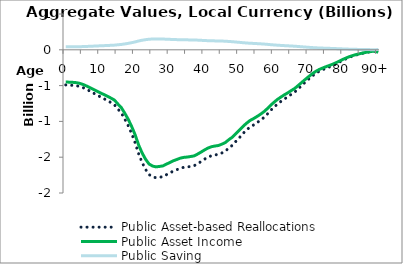
| Category | Public Asset-based Reallocations | Public Asset Income | Public Saving |
|---|---|---|---|
| 0 | -490.692 | -449.071 | 41.621 |
|  | -494.131 | -452.218 | 41.913 |
| 2 | -496.348 | -454.247 | 42.101 |
| 3 | -501.32 | -458.797 | 42.523 |
| 4 | -511.72 | -468.315 | 43.405 |
| 5 | -528.914 | -484.05 | 44.863 |
| 6 | -552.434 | -505.576 | 46.858 |
| 7 | -578.415 | -529.353 | 49.062 |
| 8 | -605.126 | -553.798 | 51.328 |
| 9 | -631.904 | -578.304 | 53.599 |
| 10 | -658.609 | -602.745 | 55.864 |
| 11 | -682.925 | -624.998 | 57.927 |
| 12 | -708.598 | -648.494 | 60.105 |
| 13 | -736.62 | -674.139 | 62.482 |
| 14 | -766.361 | -701.356 | 65.004 |
| 15 | -826.263 | -756.177 | 70.085 |
| 16 | -881.141 | -806.401 | 74.74 |
| 17 | -968.306 | -886.173 | 82.134 |
| 18 | -1061.254 | -971.236 | 90.018 |
| 19 | -1172.762 | -1073.286 | 99.476 |
| 20 | -1299.152 | -1188.955 | 110.196 |
| 21 | -1454.361 | -1331 | 123.362 |
| 22 | -1574.634 | -1441.071 | 133.563 |
| 23 | -1671.392 | -1529.622 | 141.771 |
| 24 | -1742.875 | -1595.041 | 147.834 |
| 25 | -1774.293 | -1623.795 | 150.499 |
| 26 | -1786.664 | -1635.116 | 151.548 |
| 27 | -1779.907 | -1628.932 | 150.975 |
| 28 | -1771.853 | -1621.561 | 150.292 |
| 29 | -1744.465 | -1596.496 | 147.969 |
| 30 | -1719.982 | -1574.09 | 145.892 |
| 31 | -1693.428 | -1549.788 | 143.64 |
| 32 | -1674 | -1532.008 | 141.992 |
| 33 | -1653.128 | -1512.906 | 140.221 |
| 34 | -1641.663 | -1502.414 | 139.249 |
| 35 | -1636.625 | -1497.804 | 138.822 |
| 36 | -1628.363 | -1490.243 | 138.121 |
| 37 | -1618.705 | -1481.404 | 137.302 |
| 38 | -1590.734 | -1455.805 | 134.929 |
| 39 | -1560.041 | -1427.715 | 132.326 |
| 40 | -1527.118 | -1397.585 | 129.533 |
| 41 | -1498.952 | -1371.809 | 127.144 |
| 42 | -1478.569 | -1353.154 | 125.415 |
| 43 | -1468.012 | -1343.493 | 124.52 |
| 44 | -1460.271 | -1336.408 | 123.863 |
| 45 | -1439.32 | -1317.234 | 122.086 |
| 46 | -1413.932 | -1293.999 | 119.932 |
| 47 | -1370.044 | -1253.834 | 116.21 |
| 48 | -1333.187 | -1220.104 | 113.083 |
| 49 | -1278.419 | -1169.982 | 108.438 |
| 50 | -1228.033 | -1123.869 | 104.164 |
| 51 | -1171.362 | -1072.005 | 99.357 |
| 52 | -1123.568 | -1028.265 | 95.303 |
| 53 | -1081.036 | -989.34 | 91.695 |
| 54 | -1052.806 | -963.505 | 89.301 |
| 55 | -1020.387 | -933.835 | 86.551 |
| 56 | -986.622 | -902.935 | 83.687 |
| 57 | -948.078 | -867.66 | 80.418 |
| 58 | -900.509 | -824.126 | 76.383 |
| 59 | -847.154 | -775.296 | 71.857 |
| 60 | -799.576 | -731.754 | 67.822 |
| 61 | -756.098 | -691.965 | 64.134 |
| 62 | -719.997 | -658.925 | 61.071 |
| 63 | -685.91 | -627.73 | 58.18 |
| 64 | -654.499 | -598.984 | 55.516 |
| 65 | -620.525 | -567.891 | 52.634 |
| 66 | -587.445 | -537.617 | 49.828 |
| 67 | -541.962 | -495.991 | 45.97 |
| 68 | -496.526 | -454.41 | 42.116 |
| 69 | -450.957 | -412.706 | 38.251 |
| 70 | -407.687 | -373.106 | 34.581 |
| 71 | -365.545 | -334.539 | 31.006 |
| 72 | -329.422 | -301.48 | 27.942 |
| 73 | -300.239 | -274.772 | 25.467 |
| 74 | -277.928 | -254.353 | 23.574 |
| 75 | -256.651 | -234.882 | 21.77 |
| 76 | -237.721 | -217.557 | 20.164 |
| 77 | -217.067 | -198.655 | 18.412 |
| 78 | -193.039 | -176.665 | 16.374 |
| 79 | -166.526 | -152.401 | 14.125 |
| 80 | -142.03 | -129.982 | 12.047 |
| 81 | -118.917 | -108.831 | 10.087 |
| 82 | -98.489 | -90.135 | 8.354 |
| 83 | -81.847 | -74.905 | 6.942 |
| 84 | -68.155 | -62.374 | 5.781 |
| 85 | -55.353 | -50.657 | 4.695 |
| 86 | -43.573 | -39.877 | 3.696 |
| 87 | -33.566 | -30.719 | 2.847 |
| 88 | -25.443 | -23.285 | 2.158 |
| 89 | -18.954 | -17.346 | 1.608 |
| 90+ | -38.868 | -35.571 | 3.297 |